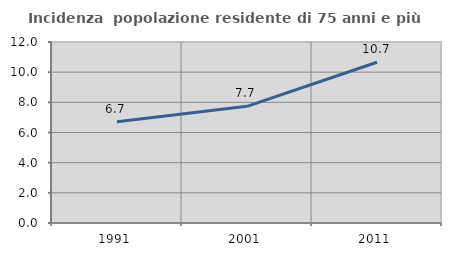
| Category | Incidenza  popolazione residente di 75 anni e più |
|---|---|
| 1991.0 | 6.708 |
| 2001.0 | 7.734 |
| 2011.0 | 10.66 |